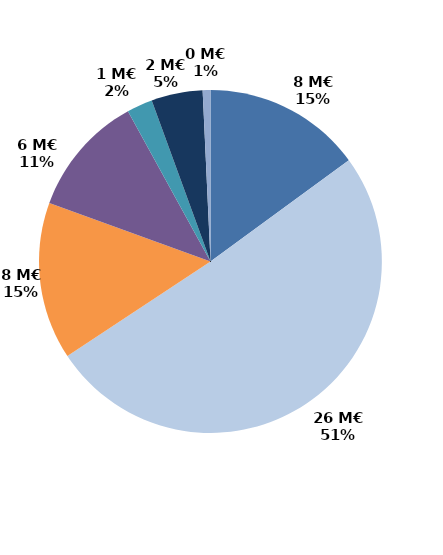
| Category | Series 0 |
|---|---|
| Accueil et information (CEP 1) | 7.669 |
| Accompagnement renforcé (CEP 2 et 3) | 26.065 |
| Suivi | 7.623 |
| Missions locales | 5.881 |
| CSP | 1.246 |
| Aide à la création d'entreprise | 2.483 |
| Aide à l'insertion | 0.375 |